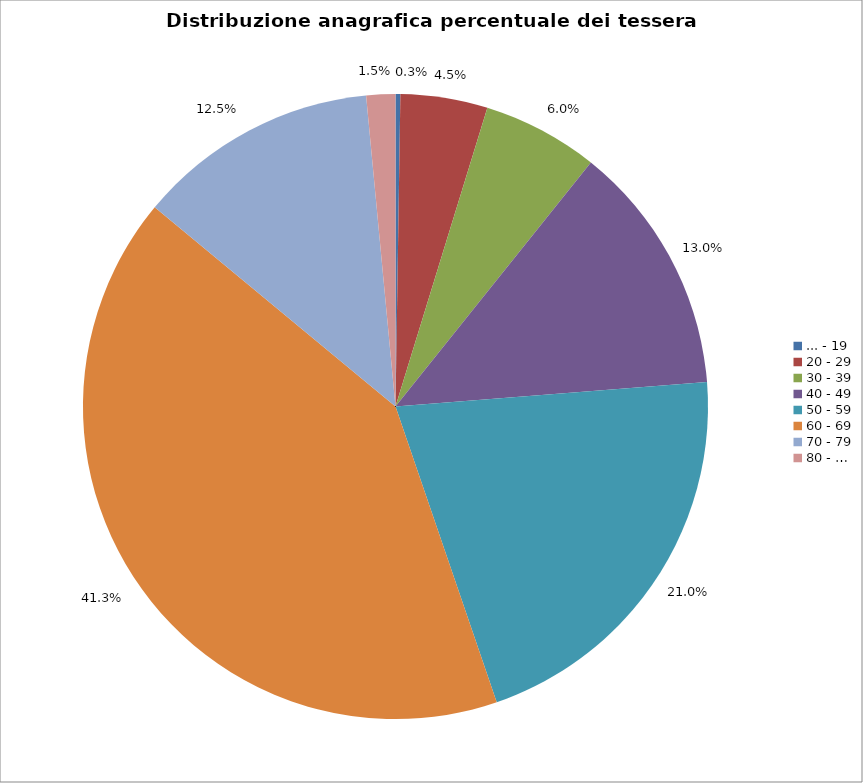
| Category | Nr. Tesserati |
|---|---|
| ... - 19 | 1 |
| 20 - 29 | 18 |
| 30 - 39 | 24 |
| 40 - 49 | 52 |
| 50 - 59 | 84 |
| 60 - 69 | 165 |
| 70 - 79 | 50 |
| 80 - … | 6 |